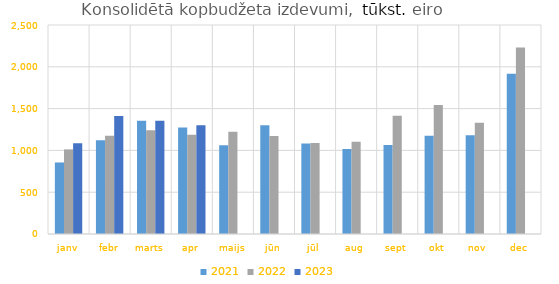
| Category | 2021 | 2022 | 2023 |
|---|---|---|---|
| janv | 855571.821 | 1011780.956 | 1084456.317 |
| febr | 1120070.85 | 1174583.857 | 1410804.255 |
| marts | 1355758.12 | 1242068.533 | 1353313.614 |
| apr | 1273663.147 | 1187341.457 | 1300627.878 |
| maijs | 1060453.286 | 1224137.323 | 0 |
| jūn | 1299852.065 | 1172050.575 | 0 |
| jūl | 1081981.296 | 1088648.602 | 0 |
| aug | 1017502.093 | 1104689.423 | 0 |
| sept | 1064391.019 | 1413387.204 | 0 |
| okt | 1173896.626 | 1543583.073 | 0 |
| nov | 1182055.554 | 1331354.715 | 0 |
| dec | 1915376.849 | 2230910.603 | 0 |